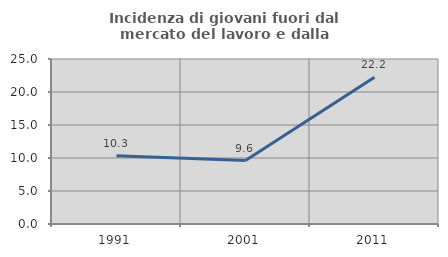
| Category | Incidenza di giovani fuori dal mercato del lavoro e dalla formazione  |
|---|---|
| 1991.0 | 10.345 |
| 2001.0 | 9.615 |
| 2011.0 | 22.222 |